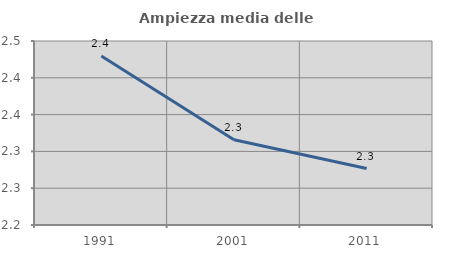
| Category | Ampiezza media delle famiglie |
|---|---|
| 1991.0 | 2.43 |
| 2001.0 | 2.316 |
| 2011.0 | 2.277 |